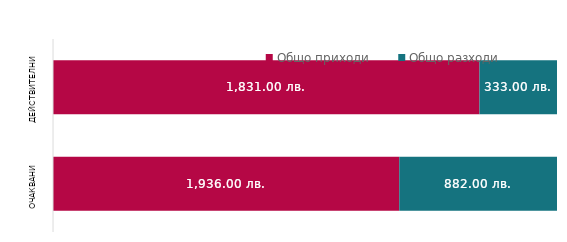
| Category | Общо приходи | Общо разходи |
|---|---|---|
| Очаквани | 1936 | 882 |
| Действителни | 1831 | 333 |